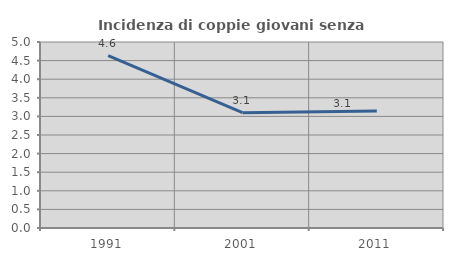
| Category | Incidenza di coppie giovani senza figli |
|---|---|
| 1991.0 | 4.631 |
| 2001.0 | 3.099 |
| 2011.0 | 3.147 |